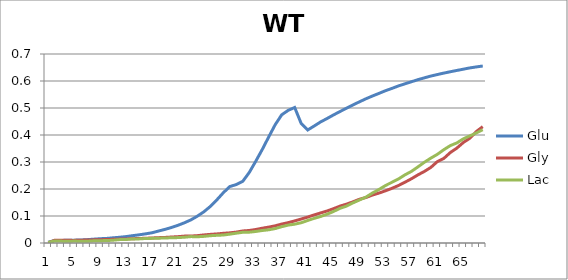
| Category | Glu | Gly | Lac |
|---|---|---|---|
| 0 | 0.003 | 0 | 0.002 |
| 1 | 0.009 | 0.01 | 0.008 |
| 2 | 0.01 | 0.01 | 0.007 |
| 3 | 0.01 | 0.01 | 0.006 |
| 4 | 0.01 | 0.01 | 0.007 |
| 5 | 0.011 | 0.01 | 0.007 |
| 6 | 0.012 | 0.011 | 0.006 |
| 7 | 0.014 | 0.012 | 0.008 |
| 8 | 0.016 | 0.012 | 0.009 |
| 9 | 0.017 | 0.013 | 0.009 |
| 10 | 0.019 | 0.014 | 0.01 |
| 11 | 0.021 | 0.014 | 0.013 |
| 12 | 0.024 | 0.015 | 0.013 |
| 13 | 0.027 | 0.016 | 0.015 |
| 14 | 0.03 | 0.017 | 0.015 |
| 15 | 0.034 | 0.018 | 0.017 |
| 16 | 0.038 | 0.019 | 0.017 |
| 17 | 0.044 | 0.02 | 0.018 |
| 18 | 0.05 | 0.021 | 0.018 |
| 19 | 0.057 | 0.022 | 0.02 |
| 20 | 0.066 | 0.024 | 0.02 |
| 21 | 0.075 | 0.025 | 0.021 |
| 22 | 0.086 | 0.026 | 0.024 |
| 23 | 0.099 | 0.027 | 0.023 |
| 24 | 0.116 | 0.03 | 0.025 |
| 25 | 0.135 | 0.032 | 0.027 |
| 26 | 0.16 | 0.034 | 0.028 |
| 27 | 0.186 | 0.036 | 0.03 |
| 28 | 0.209 | 0.038 | 0.033 |
| 29 | 0.216 | 0.04 | 0.036 |
| 30 | 0.229 | 0.045 | 0.04 |
| 31 | 0.261 | 0.046 | 0.04 |
| 32 | 0.303 | 0.05 | 0.043 |
| 33 | 0.346 | 0.055 | 0.046 |
| 34 | 0.393 | 0.059 | 0.049 |
| 35 | 0.438 | 0.064 | 0.053 |
| 36 | 0.475 | 0.07 | 0.06 |
| 37 | 0.491 | 0.075 | 0.066 |
| 38 | 0.502 | 0.082 | 0.07 |
| 39 | 0.443 | 0.089 | 0.075 |
| 40 | 0.418 | 0.096 | 0.083 |
| 41 | 0.433 | 0.104 | 0.091 |
| 42 | 0.448 | 0.111 | 0.098 |
| 43 | 0.461 | 0.119 | 0.107 |
| 44 | 0.475 | 0.127 | 0.117 |
| 45 | 0.487 | 0.137 | 0.129 |
| 46 | 0.499 | 0.144 | 0.137 |
| 47 | 0.512 | 0.153 | 0.149 |
| 48 | 0.523 | 0.162 | 0.159 |
| 49 | 0.534 | 0.169 | 0.17 |
| 50 | 0.545 | 0.178 | 0.185 |
| 51 | 0.554 | 0.185 | 0.198 |
| 52 | 0.564 | 0.193 | 0.213 |
| 53 | 0.573 | 0.202 | 0.225 |
| 54 | 0.582 | 0.213 | 0.237 |
| 55 | 0.59 | 0.225 | 0.252 |
| 56 | 0.597 | 0.238 | 0.265 |
| 57 | 0.605 | 0.252 | 0.282 |
| 58 | 0.612 | 0.265 | 0.299 |
| 59 | 0.618 | 0.28 | 0.314 |
| 60 | 0.624 | 0.302 | 0.328 |
| 61 | 0.629 | 0.313 | 0.346 |
| 62 | 0.634 | 0.335 | 0.361 |
| 63 | 0.639 | 0.351 | 0.371 |
| 64 | 0.644 | 0.372 | 0.386 |
| 65 | 0.648 | 0.388 | 0.397 |
| 66 | 0.652 | 0.413 | 0.407 |
| 67 | 0.656 | 0.431 | 0.42 |